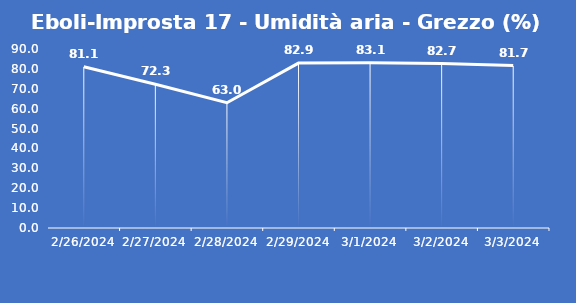
| Category | Eboli-Improsta 17 - Umidità aria - Grezzo (%) |
|---|---|
| 2/26/24 | 81.1 |
| 2/27/24 | 72.3 |
| 2/28/24 | 63 |
| 2/29/24 | 82.9 |
| 3/1/24 | 83.1 |
| 3/2/24 | 82.7 |
| 3/3/24 | 81.7 |